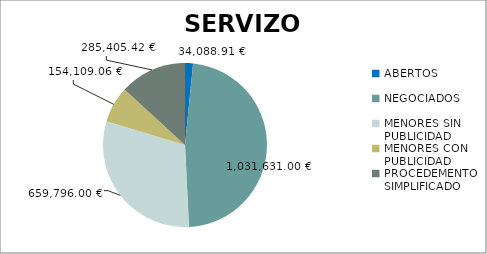
| Category | Series 0 |
|---|---|
| ABERTOS  | 34088.91 |
| NEGOCIADOS  | 1031631 |
| MENORES SIN PUBLICIDAD | 659796 |
| MENORES CON PUBLICIDAD | 154109.06 |
| PROCEDEMENTO SIMPLIFICADO | 285405.42 |